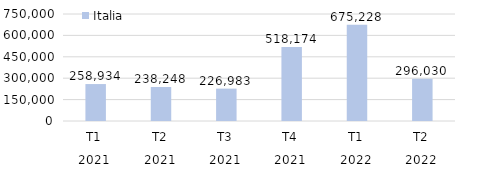
| Category | Italia |
|---|---|
| 0 | 258933.889 |
| 1 | 238247.791 |
| 2 | 226983 |
| 3 | 518173.522 |
| 4 | 675227.656 |
| 5 | 296030 |